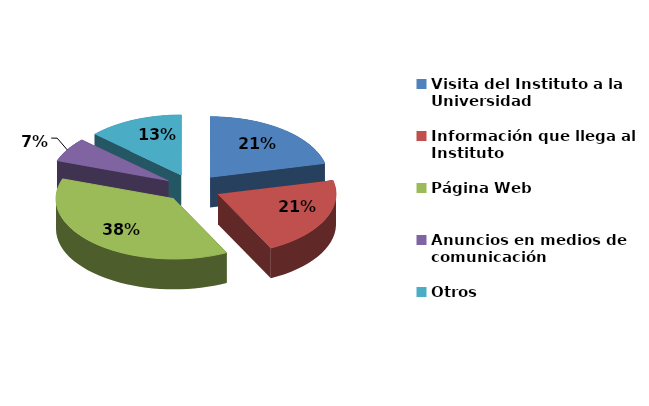
| Category | Series 0 |
|---|---|
| Visita del Instituto a la Universidad | 13 |
| Información que llega al Instituto | 13 |
| Página Web | 23 |
| Anuncios en medios de comunicación | 4 |
| Otros | 8 |